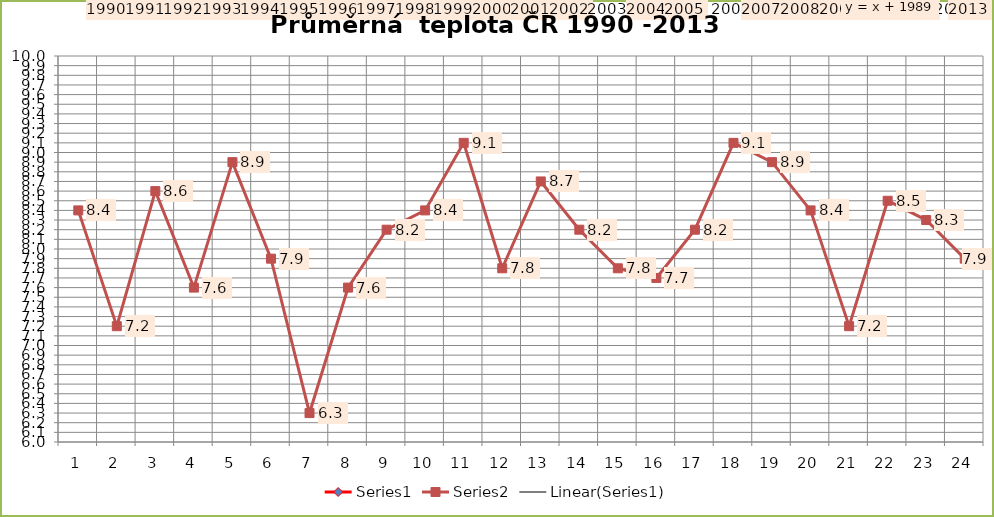
| Category | Series 0 | Series 1 |
|---|---|---|
| 0 | 1990 | 8.4 |
| 1 | 1991 | 7.2 |
| 2 | 1992 | 8.6 |
| 3 | 1993 | 7.6 |
| 4 | 1994 | 8.9 |
| 5 | 1995 | 7.9 |
| 6 | 1996 | 6.3 |
| 7 | 1997 | 7.6 |
| 8 | 1998 | 8.2 |
| 9 | 1999 | 8.4 |
| 10 | 2000 | 9.1 |
| 11 | 2001 | 7.8 |
| 12 | 2002 | 8.7 |
| 13 | 2003 | 8.2 |
| 14 | 2004 | 7.8 |
| 15 | 2005 | 7.7 |
| 16 | 2006 | 8.2 |
| 17 | 2007 | 9.1 |
| 18 | 2008 | 8.9 |
| 19 | 2009 | 8.4 |
| 20 | 2010 | 7.2 |
| 21 | 2011 | 8.5 |
| 22 | 2012 | 8.3 |
| 23 | 2013 | 7.9 |